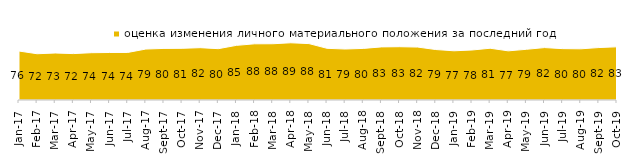
| Category | оценка изменения личного материального положения за последний год |
|---|---|
| 2017-01-01 | 76.3 |
| 2017-02-01 | 72.1 |
| 2017-03-01 | 73.2 |
| 2017-04-01 | 72.3 |
| 2017-05-01 | 73.7 |
| 2017-06-01 | 74.05 |
| 2017-07-01 | 74.1 |
| 2017-08-01 | 79.4 |
| 2017-09-01 | 80.4 |
| 2017-10-01 | 80.55 |
| 2017-11-01 | 81.55 |
| 2017-12-01 | 80 |
| 2018-01-01 | 85.15 |
| 2018-02-01 | 87.55 |
| 2018-03-01 | 87.65 |
| 2018-04-01 | 89.15 |
| 2018-05-01 | 87.9 |
| 2018-06-01 | 80.55 |
| 2018-07-01 | 79.45 |
| 2018-08-01 | 80.4 |
| 2018-09-01 | 82.75 |
| 2018-10-01 | 83.05 |
| 2018-11-01 | 82.485 |
| 2018-12-01 | 78.65 |
| 2019-01-01 | 76.7 |
| 2019-02-01 | 77.9 |
| 2019-03-01 | 80.656 |
| 2019-04-01 | 76.584 |
| 2019-05-01 | 79 |
| 2019-06-01 | 81.696 |
| 2019-07-01 | 80.05 |
| 2019-08-01 | 79.77 |
| 2019-09-01 | 81.733 |
| 2019-10-01 | 82.871 |